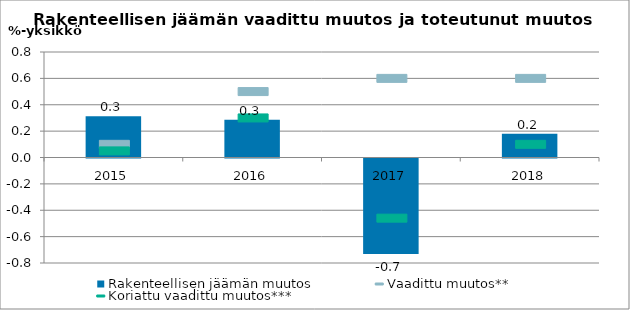
| Category | Rakenteellisen jäämän muutos |
|---|---|
| 2015.0 | 0.314 |
| 2016.0 | 0.286 |
| 2017.0 | -0.724 |
| 2018.0 | 0.18 |